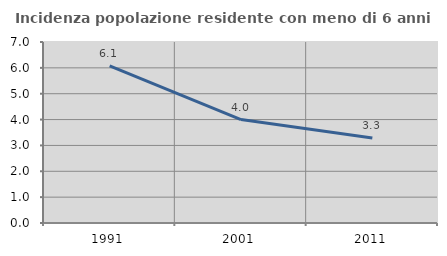
| Category | Incidenza popolazione residente con meno di 6 anni |
|---|---|
| 1991.0 | 6.08 |
| 2001.0 | 4 |
| 2011.0 | 3.291 |